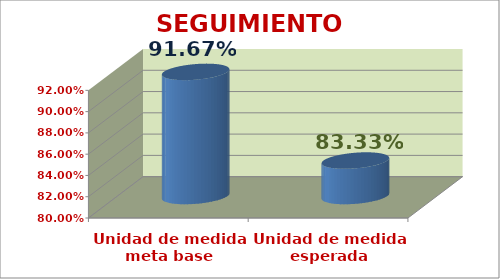
| Category | SEGUIMIENTO ACADÉMICO |
|---|---|
| Unidad de medida meta base | 0.917 |
| Unidad de medida esperada | 0.833 |